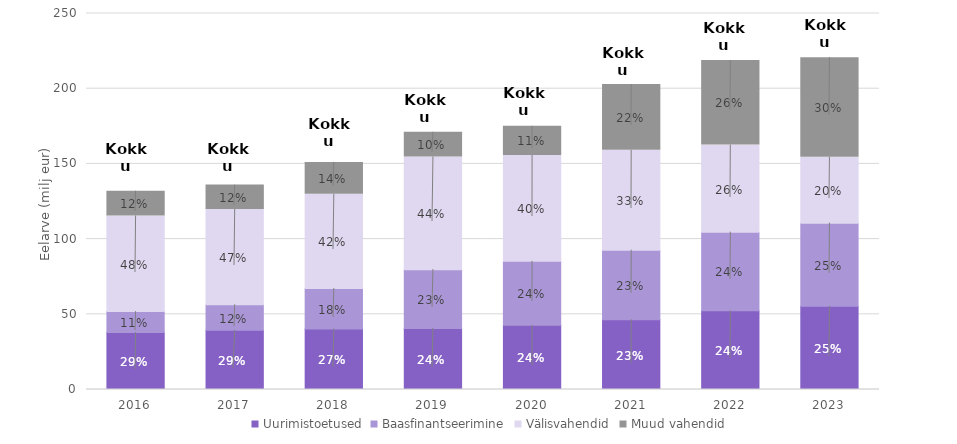
| Category | Uurimistoetused | Baasfinantseerimine | Välisvahendid | Muud vahendid |
|---|---|---|---|---|
| 2016.0 | 37.9 | 13.9 | 63.6 | 16.4 |
| 2017.0 | 39.4 | 16.9 | 63.4 | 16.2 |
| 2018.0 | 40.2 | 26.9 | 62.7 | 21.2 |
| 2019.0 | 40.6 | 39.1 | 74.9 | 16.4 |
| 2020.0 | 42.7 | 42.5 | 70.4 | 19.4 |
| 2021.0 | 46.31 | 46.31 | 66.42 | 43.73 |
| 2022.0 | 52.31 | 52.31 | 57.9 | 56.21 |
| 2023.0 | 55.3 | 55.3 | 43.8 | 66.2 |